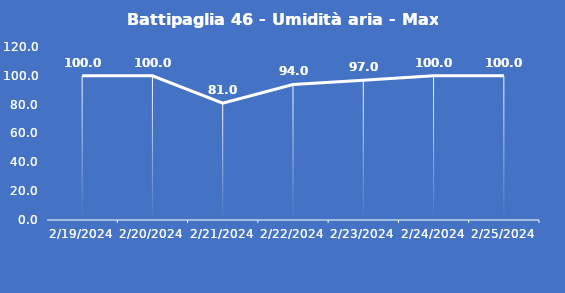
| Category | Battipaglia 46 - Umidità aria - Max (%) |
|---|---|
| 2/19/24 | 100 |
| 2/20/24 | 100 |
| 2/21/24 | 81 |
| 2/22/24 | 94 |
| 2/23/24 | 97 |
| 2/24/24 | 100 |
| 2/25/24 | 100 |